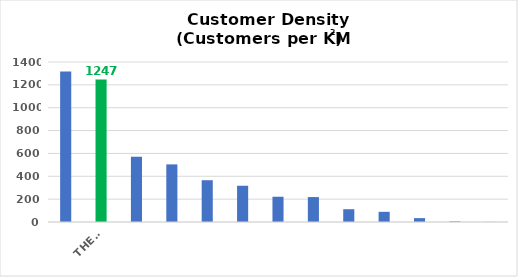
| Category | Series 0 |
|---|---|
|  | 1316 |
| THESL | 1247.1 |